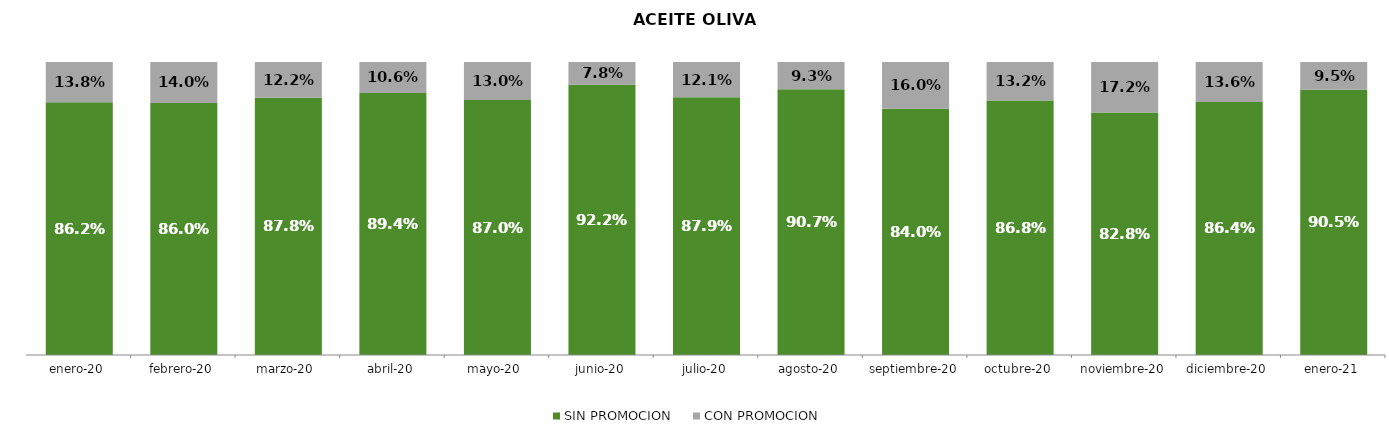
| Category | SIN PROMOCION   | CON PROMOCION   |
|---|---|---|
| 2020-01-01 | 0.862 | 0.138 |
| 2020-02-01 | 0.86 | 0.14 |
| 2020-03-01 | 0.878 | 0.122 |
| 2020-04-01 | 0.894 | 0.106 |
| 2020-05-01 | 0.87 | 0.13 |
| 2020-06-01 | 0.922 | 0.078 |
| 2020-07-01 | 0.879 | 0.121 |
| 2020-08-01 | 0.907 | 0.093 |
| 2020-09-01 | 0.84 | 0.16 |
| 2020-10-01 | 0.868 | 0.132 |
| 2020-11-01 | 0.828 | 0.172 |
| 2020-12-01 | 0.864 | 0.136 |
| 2021-01-01 | 0.905 | 0.095 |